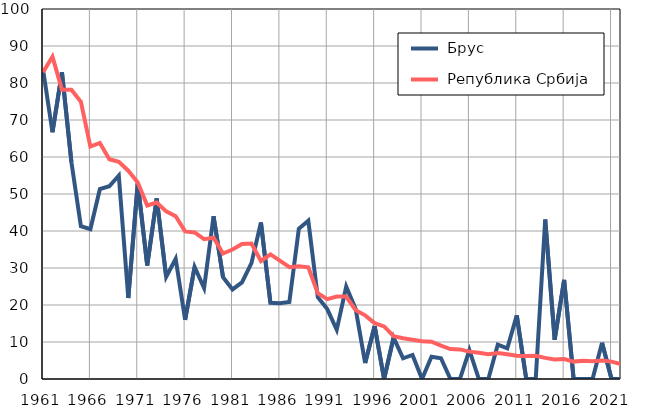
| Category |  Брус |  Република Србија |
|---|---|---|
| 1961.0 | 83.7 | 82.9 |
| 1962.0 | 66.7 | 87.1 |
| 1963.0 | 82.9 | 78.2 |
| 1964.0 | 58.6 | 78.2 |
| 1965.0 | 41.3 | 74.9 |
| 1966.0 | 40.5 | 62.8 |
| 1967.0 | 51.3 | 63.8 |
| 1968.0 | 52.1 | 59.4 |
| 1969.0 | 55 | 58.7 |
| 1970.0 | 21.9 | 56.3 |
| 1971.0 | 52.9 | 53.1 |
| 1972.0 | 30.7 | 46.9 |
| 1973.0 | 48.8 | 47.7 |
| 1974.0 | 27.6 | 45.3 |
| 1975.0 | 32.5 | 44 |
| 1976.0 | 16 | 39.9 |
| 1977.0 | 30.3 | 39.6 |
| 1978.0 | 24.6 | 37.8 |
| 1979.0 | 44 | 38.2 |
| 1980.0 | 27.5 | 33.9 |
| 1981.0 | 24.2 | 35 |
| 1982.0 | 26.1 | 36.5 |
| 1983.0 | 31.3 | 36.6 |
| 1984.0 | 42.3 | 31.9 |
| 1985.0 | 20.6 | 33.7 |
| 1986.0 | 20.5 | 32 |
| 1987.0 | 20.8 | 30.2 |
| 1988.0 | 40.6 | 30.5 |
| 1989.0 | 42.8 | 30.2 |
| 1990.0 | 22.1 | 23.2 |
| 1991.0 | 18.9 | 21.6 |
| 1992.0 | 13.3 | 22.3 |
| 1993.0 | 25 | 22.3 |
| 1994.0 | 18.9 | 18.6 |
| 1995.0 | 4.3 | 17.2 |
| 1996.0 | 14.3 | 15.1 |
| 1997.0 | 0 | 14.2 |
| 1998.0 | 11.2 | 11.6 |
| 1999.0 | 5.6 | 11 |
| 2000.0 | 6.5 | 10.6 |
| 2001.0 | 0 | 10.2 |
| 2002.0 | 6 | 10.1 |
| 2003.0 | 5.6 | 9 |
| 2004.0 | 0 | 8.1 |
| 2005.0 | 0 | 8 |
| 2006.0 | 7.8 | 7.4 |
| 2007.0 | 0 | 7.1 |
| 2008.0 | 0 | 6.7 |
| 2009.0 | 9.3 | 7 |
| 2010.0 | 8.3 | 6.7 |
| 2011.0 | 17.2 | 6.3 |
| 2012.0 | 0 | 6.2 |
| 2013.0 | 0 | 6.3 |
| 2014.0 | 43.1 | 5.7 |
| 2015.0 | 10.6 | 5.3 |
| 2016.0 | 26.8 | 5.4 |
| 2017.0 | 0 | 4.7 |
| 2018.0 | 0 | 4.9 |
| 2019.0 | 0 | 4.8 |
| 2020.0 | 9.8 | 5 |
| 2021.0 | 0 | 4.7 |
| 2022.0 | 0 | 4 |